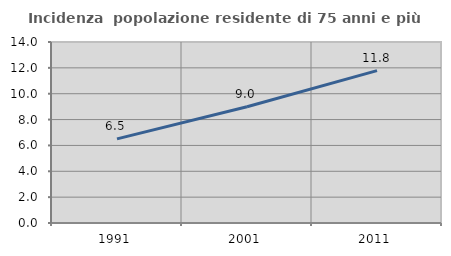
| Category | Incidenza  popolazione residente di 75 anni e più |
|---|---|
| 1991.0 | 6.508 |
| 2001.0 | 8.993 |
| 2011.0 | 11.786 |